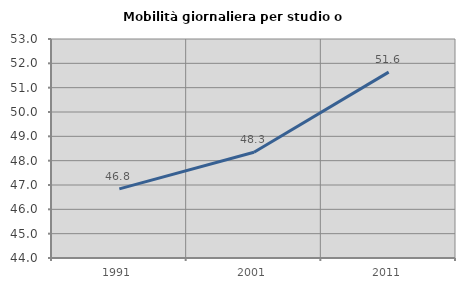
| Category | Mobilità giornaliera per studio o lavoro |
|---|---|
| 1991.0 | 46.84 |
| 2001.0 | 48.345 |
| 2011.0 | 51.64 |